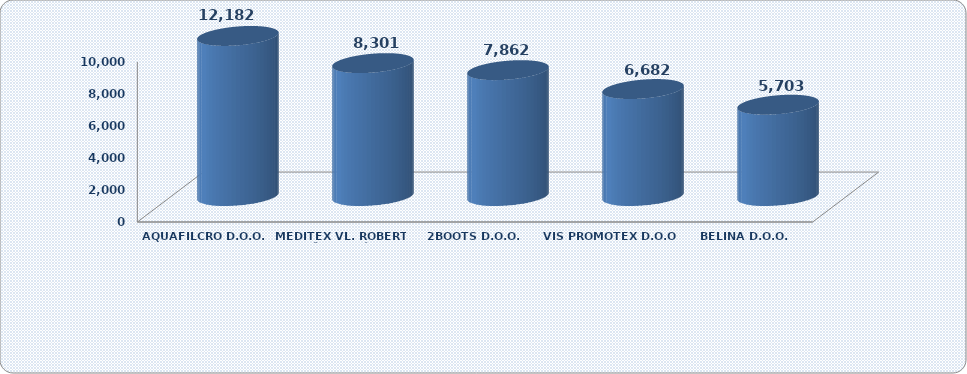
| Category | Dobit razdoblja |
|---|---|
| AQUAFILCRO D.O.O. | 12182.29 |
| MEDITEX VL. ROBERT ČRNJEVIĆ | 8301.143 |
| 2BOOTS D.O.O. | 7862.303 |
| VIS PROMOTEX D.O.O. | 6681.843 |
| BELINA D.O.O. | 5702.904 |